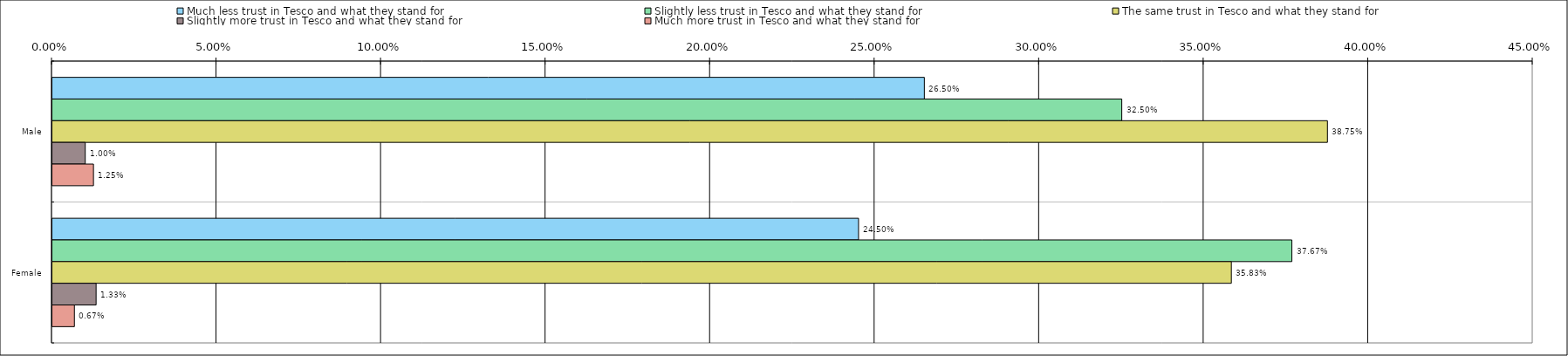
| Category | Much less trust in Tesco and what they stand for | Slightly less trust in Tesco and what they stand for | The same trust in Tesco and what they stand for | Slightly more trust in Tesco and what they stand for | Much more trust in Tesco and what they stand for |
|---|---|---|---|---|---|
| 0 | 0.265 | 0.325 | 0.388 | 0.01 | 0.012 |
| 1 | 0.245 | 0.377 | 0.358 | 0.013 | 0.007 |